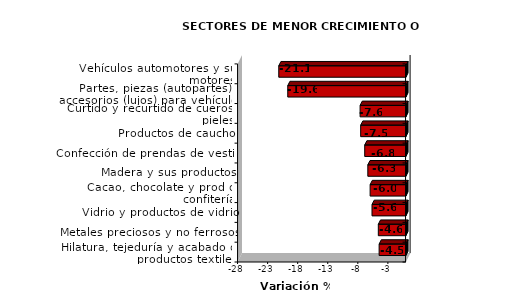
| Category | Series 0 |
|---|---|
| Vehículos automotores y sus motores | -21.144 |
| Partes, piezas (autopartes) y accesorios (lujos) para vehículos | -19.649 |
| Curtido y recurtido de cueros y pieles | -7.621 |
| Productos de caucho | -7.525 |
| Confección de prendas de vestir | -6.85 |
| Madera y sus productos | -6.333 |
| Cacao, chocolate y prod de confitería | -5.951 |
| Vidrio y productos de vidrio | -5.636 |
| Metales preciosos y no ferrosos | -4.587 |
| Hilatura, tejeduría y acabado de productos textiles | -4.455 |